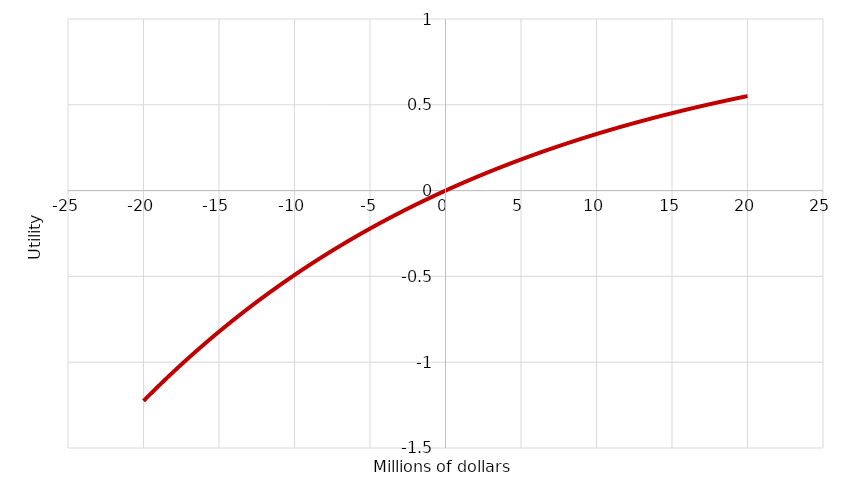
| Category | Series 0 |
|---|---|
| -20.0 | -1.226 |
| -19.9 | -1.217 |
| -19.799999999999997 | -1.208 |
| -19.699999999999996 | -1.199 |
| -19.599999999999994 | -1.19 |
| -19.499999999999993 | -1.182 |
| -19.39999999999999 | -1.173 |
| -19.29999999999999 | -1.164 |
| -19.19999999999999 | -1.156 |
| -19.099999999999987 | -1.147 |
| -18.999999999999986 | -1.138 |
| -18.899999999999984 | -1.13 |
| -18.799999999999983 | -1.121 |
| -18.69999999999998 | -1.113 |
| -18.59999999999998 | -1.105 |
| -18.49999999999998 | -1.096 |
| -18.399999999999977 | -1.088 |
| -18.299999999999976 | -1.079 |
| -18.199999999999974 | -1.071 |
| -18.099999999999973 | -1.063 |
| -17.99999999999997 | -1.055 |
| -17.89999999999997 | -1.046 |
| -17.79999999999997 | -1.038 |
| -17.699999999999967 | -1.03 |
| -17.599999999999966 | -1.022 |
| -17.499999999999964 | -1.014 |
| -17.399999999999963 | -1.006 |
| -17.29999999999996 | -0.998 |
| -17.19999999999996 | -0.99 |
| -17.09999999999996 | -0.982 |
| -16.999999999999957 | -0.974 |
| -16.899999999999956 | -0.966 |
| -16.799999999999955 | -0.958 |
| -16.699999999999953 | -0.951 |
| -16.59999999999995 | -0.943 |
| -16.49999999999995 | -0.935 |
| -16.39999999999995 | -0.927 |
| -16.299999999999947 | -0.92 |
| -16.199999999999946 | -0.912 |
| -16.099999999999945 | -0.904 |
| -15.999999999999945 | -0.897 |
| -15.899999999999945 | -0.889 |
| -15.799999999999946 | -0.882 |
| -15.699999999999946 | -0.874 |
| -15.599999999999946 | -0.867 |
| -15.499999999999947 | -0.859 |
| -15.399999999999947 | -0.852 |
| -15.299999999999947 | -0.844 |
| -15.199999999999948 | -0.837 |
| -15.099999999999948 | -0.83 |
| -14.999999999999948 | -0.822 |
| -14.899999999999949 | -0.815 |
| -14.79999999999995 | -0.808 |
| -14.69999999999995 | -0.801 |
| -14.59999999999995 | -0.793 |
| -14.49999999999995 | -0.786 |
| -14.39999999999995 | -0.779 |
| -14.299999999999951 | -0.772 |
| -14.199999999999951 | -0.765 |
| -14.099999999999952 | -0.758 |
| -13.999999999999952 | -0.751 |
| -13.899999999999952 | -0.744 |
| -13.799999999999953 | -0.737 |
| -13.699999999999953 | -0.73 |
| -13.599999999999953 | -0.723 |
| -13.499999999999954 | -0.716 |
| -13.399999999999954 | -0.709 |
| -13.299999999999955 | -0.702 |
| -13.199999999999955 | -0.696 |
| -13.099999999999955 | -0.689 |
| -12.999999999999956 | -0.682 |
| -12.899999999999956 | -0.675 |
| -12.799999999999956 | -0.669 |
| -12.699999999999957 | -0.662 |
| -12.599999999999957 | -0.655 |
| -12.499999999999957 | -0.649 |
| -12.399999999999958 | -0.642 |
| -12.299999999999958 | -0.636 |
| -12.199999999999958 | -0.629 |
| -12.099999999999959 | -0.623 |
| -11.99999999999996 | -0.616 |
| -11.89999999999996 | -0.61 |
| -11.79999999999996 | -0.603 |
| -11.69999999999996 | -0.597 |
| -11.59999999999996 | -0.591 |
| -11.499999999999961 | -0.584 |
| -11.399999999999961 | -0.578 |
| -11.299999999999962 | -0.572 |
| -11.199999999999962 | -0.565 |
| -11.099999999999962 | -0.559 |
| -10.999999999999963 | -0.553 |
| -10.899999999999963 | -0.547 |
| -10.799999999999963 | -0.54 |
| -10.699999999999964 | -0.534 |
| -10.599999999999964 | -0.528 |
| -10.499999999999964 | -0.522 |
| -10.399999999999965 | -0.516 |
| -10.299999999999965 | -0.51 |
| -10.199999999999966 | -0.504 |
| -10.099999999999966 | -0.498 |
| -9.999999999999966 | -0.492 |
| -9.899999999999967 | -0.486 |
| -9.799999999999967 | -0.48 |
| -9.699999999999967 | -0.474 |
| -9.599999999999968 | -0.468 |
| -9.499999999999968 | -0.462 |
| -9.399999999999968 | -0.457 |
| -9.299999999999969 | -0.451 |
| -9.199999999999969 | -0.445 |
| -9.09999999999997 | -0.439 |
| -8.99999999999997 | -0.433 |
| -8.89999999999997 | -0.428 |
| -8.79999999999997 | -0.422 |
| -8.69999999999997 | -0.416 |
| -8.599999999999971 | -0.411 |
| -8.499999999999972 | -0.405 |
| -8.399999999999972 | -0.399 |
| -8.299999999999972 | -0.394 |
| -8.199999999999973 | -0.388 |
| -8.099999999999973 | -0.383 |
| -7.999999999999973 | -0.377 |
| -7.899999999999974 | -0.372 |
| -7.799999999999974 | -0.366 |
| -7.699999999999974 | -0.361 |
| -7.599999999999975 | -0.355 |
| -7.499999999999975 | -0.35 |
| -7.3999999999999755 | -0.345 |
| -7.299999999999976 | -0.339 |
| -7.199999999999976 | -0.334 |
| -7.0999999999999766 | -0.328 |
| -6.999999999999977 | -0.323 |
| -6.899999999999977 | -0.318 |
| -6.799999999999978 | -0.313 |
| -6.699999999999978 | -0.307 |
| -6.599999999999978 | -0.302 |
| -6.499999999999979 | -0.297 |
| -6.399999999999979 | -0.292 |
| -6.299999999999979 | -0.287 |
| -6.19999999999998 | -0.282 |
| -6.09999999999998 | -0.276 |
| -5.9999999999999805 | -0.271 |
| -5.899999999999981 | -0.266 |
| -5.799999999999981 | -0.261 |
| -5.6999999999999815 | -0.256 |
| -5.599999999999982 | -0.251 |
| -5.499999999999982 | -0.246 |
| -5.399999999999983 | -0.241 |
| -5.299999999999983 | -0.236 |
| -5.199999999999983 | -0.231 |
| -5.099999999999984 | -0.226 |
| -4.999999999999984 | -0.221 |
| -4.899999999999984 | -0.217 |
| -4.799999999999985 | -0.212 |
| -4.699999999999985 | -0.207 |
| -4.599999999999985 | -0.202 |
| -4.499999999999986 | -0.197 |
| -4.399999999999986 | -0.192 |
| -4.2999999999999865 | -0.188 |
| -4.199999999999987 | -0.183 |
| -4.099999999999987 | -0.178 |
| -3.999999999999987 | -0.174 |
| -3.899999999999987 | -0.169 |
| -3.799999999999987 | -0.164 |
| -3.699999999999987 | -0.16 |
| -3.5999999999999868 | -0.155 |
| -3.4999999999999867 | -0.15 |
| -3.3999999999999866 | -0.146 |
| -3.2999999999999865 | -0.141 |
| -3.1999999999999864 | -0.137 |
| -3.0999999999999863 | -0.132 |
| -2.9999999999999862 | -0.128 |
| -2.899999999999986 | -0.123 |
| -2.799999999999986 | -0.119 |
| -2.699999999999986 | -0.114 |
| -2.599999999999986 | -0.11 |
| -2.499999999999986 | -0.105 |
| -2.3999999999999857 | -0.101 |
| -2.2999999999999856 | -0.096 |
| -2.1999999999999855 | -0.092 |
| -2.0999999999999854 | -0.088 |
| -1.9999999999999853 | -0.083 |
| -1.8999999999999853 | -0.079 |
| -1.7999999999999852 | -0.075 |
| -1.699999999999985 | -0.07 |
| -1.599999999999985 | -0.066 |
| -1.499999999999985 | -0.062 |
| -1.3999999999999848 | -0.058 |
| -1.2999999999999847 | -0.053 |
| -1.1999999999999846 | -0.049 |
| -1.0999999999999845 | -0.045 |
| -0.9999999999999846 | -0.041 |
| -0.8999999999999846 | -0.037 |
| -0.7999999999999846 | -0.033 |
| -0.6999999999999846 | -0.028 |
| -0.5999999999999847 | -0.024 |
| -0.4999999999999847 | -0.02 |
| -0.3999999999999847 | -0.016 |
| -0.2999999999999847 | -0.012 |
| -0.19999999999998472 | -0.008 |
| -0.09999999999998471 | -0.004 |
| 1.529332216421153e-14 | 0 |
| 0.1000000000000153 | 0.004 |
| 0.2000000000000153 | 0.008 |
| 0.3000000000000153 | 0.012 |
| 0.40000000000001534 | 0.016 |
| 0.5000000000000153 | 0.02 |
| 0.6000000000000153 | 0.024 |
| 0.7000000000000153 | 0.028 |
| 0.8000000000000153 | 0.031 |
| 0.9000000000000152 | 0.035 |
| 1.0000000000000153 | 0.039 |
| 1.1000000000000154 | 0.043 |
| 1.2000000000000155 | 0.047 |
| 1.3000000000000156 | 0.051 |
| 1.4000000000000157 | 0.054 |
| 1.5000000000000158 | 0.058 |
| 1.6000000000000159 | 0.062 |
| 1.700000000000016 | 0.066 |
| 1.800000000000016 | 0.069 |
| 1.9000000000000161 | 0.073 |
| 2.000000000000016 | 0.077 |
| 2.100000000000016 | 0.081 |
| 2.200000000000016 | 0.084 |
| 2.3000000000000163 | 0.088 |
| 2.4000000000000163 | 0.092 |
| 2.5000000000000164 | 0.095 |
| 2.6000000000000165 | 0.099 |
| 2.7000000000000166 | 0.102 |
| 2.8000000000000167 | 0.106 |
| 2.900000000000017 | 0.11 |
| 3.000000000000017 | 0.113 |
| 3.100000000000017 | 0.117 |
| 3.200000000000017 | 0.12 |
| 3.300000000000017 | 0.124 |
| 3.4000000000000172 | 0.127 |
| 3.5000000000000173 | 0.131 |
| 3.6000000000000174 | 0.134 |
| 3.7000000000000175 | 0.138 |
| 3.8000000000000176 | 0.141 |
| 3.9000000000000177 | 0.144 |
| 4.000000000000018 | 0.148 |
| 4.100000000000017 | 0.151 |
| 4.200000000000017 | 0.155 |
| 4.300000000000017 | 0.158 |
| 4.400000000000016 | 0.161 |
| 4.500000000000016 | 0.165 |
| 4.600000000000016 | 0.168 |
| 4.700000000000015 | 0.171 |
| 4.800000000000015 | 0.175 |
| 4.900000000000015 | 0.178 |
| 5.000000000000014 | 0.181 |
| 5.100000000000014 | 0.185 |
| 5.2000000000000135 | 0.188 |
| 5.300000000000013 | 0.191 |
| 5.400000000000013 | 0.194 |
| 5.500000000000012 | 0.198 |
| 5.600000000000012 | 0.201 |
| 5.700000000000012 | 0.204 |
| 5.800000000000011 | 0.207 |
| 5.900000000000011 | 0.21 |
| 6.000000000000011 | 0.213 |
| 6.10000000000001 | 0.217 |
| 6.20000000000001 | 0.22 |
| 6.30000000000001 | 0.223 |
| 6.400000000000009 | 0.226 |
| 6.500000000000009 | 0.229 |
| 6.6000000000000085 | 0.232 |
| 6.700000000000008 | 0.235 |
| 6.800000000000008 | 0.238 |
| 6.9000000000000075 | 0.241 |
| 7.000000000000007 | 0.244 |
| 7.100000000000007 | 0.247 |
| 7.200000000000006 | 0.25 |
| 7.300000000000006 | 0.253 |
| 7.400000000000006 | 0.256 |
| 7.500000000000005 | 0.259 |
| 7.600000000000005 | 0.262 |
| 7.700000000000005 | 0.265 |
| 7.800000000000004 | 0.268 |
| 7.900000000000004 | 0.271 |
| 8.000000000000004 | 0.274 |
| 8.100000000000003 | 0.277 |
| 8.200000000000003 | 0.28 |
| 8.300000000000002 | 0.283 |
| 8.400000000000002 | 0.285 |
| 8.500000000000002 | 0.288 |
| 8.600000000000001 | 0.291 |
| 8.700000000000001 | 0.294 |
| 8.8 | 0.297 |
| 8.9 | 0.3 |
| 9.0 | 0.302 |
| 9.1 | 0.305 |
| 9.2 | 0.308 |
| 9.299999999999999 | 0.311 |
| 9.399999999999999 | 0.313 |
| 9.499999999999998 | 0.316 |
| 9.599999999999998 | 0.319 |
| 9.699999999999998 | 0.322 |
| 9.799999999999997 | 0.324 |
| 9.899999999999997 | 0.327 |
| 9.999999999999996 | 0.33 |
| 10.099999999999996 | 0.332 |
| 10.199999999999996 | 0.335 |
| 10.299999999999995 | 0.338 |
| 10.399999999999995 | 0.34 |
| 10.499999999999995 | 0.343 |
| 10.599999999999994 | 0.346 |
| 10.699999999999994 | 0.348 |
| 10.799999999999994 | 0.351 |
| 10.899999999999993 | 0.353 |
| 10.999999999999993 | 0.356 |
| 11.099999999999993 | 0.359 |
| 11.199999999999992 | 0.361 |
| 11.299999999999992 | 0.364 |
| 11.399999999999991 | 0.366 |
| 11.499999999999991 | 0.369 |
| 11.59999999999999 | 0.371 |
| 11.69999999999999 | 0.374 |
| 11.79999999999999 | 0.376 |
| 11.89999999999999 | 0.379 |
| 11.99999999999999 | 0.381 |
| 12.099999999999989 | 0.384 |
| 12.199999999999989 | 0.386 |
| 12.299999999999988 | 0.389 |
| 12.399999999999988 | 0.391 |
| 12.499999999999988 | 0.394 |
| 12.599999999999987 | 0.396 |
| 12.699999999999987 | 0.398 |
| 12.799999999999986 | 0.401 |
| 12.899999999999986 | 0.403 |
| 12.999999999999986 | 0.406 |
| 13.099999999999985 | 0.408 |
| 13.199999999999985 | 0.41 |
| 13.299999999999985 | 0.413 |
| 13.399999999999984 | 0.415 |
| 13.499999999999984 | 0.417 |
| 13.599999999999984 | 0.42 |
| 13.699999999999983 | 0.422 |
| 13.799999999999983 | 0.424 |
| 13.899999999999983 | 0.427 |
| 13.999999999999982 | 0.429 |
| 14.099999999999982 | 0.431 |
| 14.199999999999982 | 0.433 |
| 14.299999999999981 | 0.436 |
| 14.39999999999998 | 0.438 |
| 14.49999999999998 | 0.44 |
| 14.59999999999998 | 0.442 |
| 14.69999999999998 | 0.445 |
| 14.79999999999998 | 0.447 |
| 14.899999999999979 | 0.449 |
| 14.999999999999979 | 0.451 |
| 15.099999999999978 | 0.453 |
| 15.199999999999978 | 0.456 |
| 15.299999999999978 | 0.458 |
| 15.399999999999977 | 0.46 |
| 15.499999999999977 | 0.462 |
| 15.599999999999977 | 0.464 |
| 15.699999999999976 | 0.466 |
| 15.799999999999976 | 0.469 |
| 15.899999999999975 | 0.471 |
| 15.999999999999975 | 0.473 |
| 16.099999999999977 | 0.475 |
| 16.199999999999978 | 0.477 |
| 16.29999999999998 | 0.479 |
| 16.39999999999998 | 0.481 |
| 16.499999999999982 | 0.483 |
| 16.599999999999984 | 0.485 |
| 16.699999999999985 | 0.487 |
| 16.799999999999986 | 0.489 |
| 16.899999999999988 | 0.491 |
| 16.99999999999999 | 0.493 |
| 17.09999999999999 | 0.495 |
| 17.199999999999992 | 0.497 |
| 17.299999999999994 | 0.499 |
| 17.399999999999995 | 0.501 |
| 17.499999999999996 | 0.503 |
| 17.599999999999998 | 0.505 |
| 17.7 | 0.507 |
| 17.8 | 0.509 |
| 17.900000000000002 | 0.511 |
| 18.000000000000004 | 0.513 |
| 18.100000000000005 | 0.515 |
| 18.200000000000006 | 0.517 |
| 18.300000000000008 | 0.519 |
| 18.40000000000001 | 0.521 |
| 18.50000000000001 | 0.523 |
| 18.600000000000012 | 0.525 |
| 18.700000000000014 | 0.527 |
| 18.800000000000015 | 0.529 |
| 18.900000000000016 | 0.531 |
| 19.000000000000018 | 0.532 |
| 19.10000000000002 | 0.534 |
| 19.20000000000002 | 0.536 |
| 19.300000000000022 | 0.538 |
| 19.400000000000023 | 0.54 |
| 19.500000000000025 | 0.542 |
| 19.600000000000026 | 0.543 |
| 19.700000000000028 | 0.545 |
| 19.80000000000003 | 0.547 |
| 19.90000000000003 | 0.549 |
| 20.000000000000032 | 0.551 |